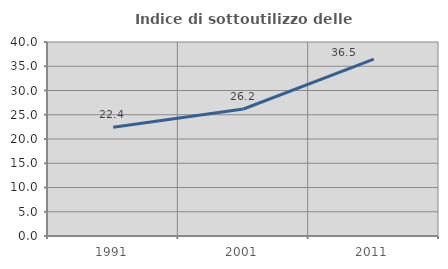
| Category | Indice di sottoutilizzo delle abitazioni  |
|---|---|
| 1991.0 | 22.414 |
| 2001.0 | 26.19 |
| 2011.0 | 36.486 |